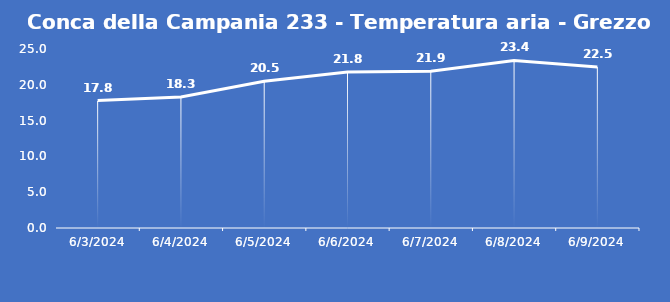
| Category | Conca della Campania 233 - Temperatura aria - Grezzo (°C) |
|---|---|
| 6/3/24 | 17.8 |
| 6/4/24 | 18.3 |
| 6/5/24 | 20.5 |
| 6/6/24 | 21.8 |
| 6/7/24 | 21.9 |
| 6/8/24 | 23.4 |
| 6/9/24 | 22.5 |